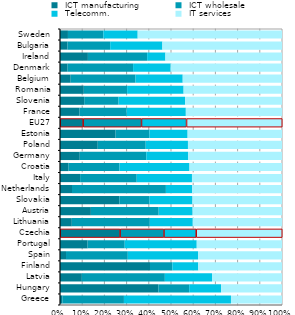
| Category |  ICT manufacturing |  ICT wholesale |  Telecomm. |  IT services |
|---|---|---|---|---|
| Greece | 0.011 | 0.277 | 0.482 | 0.23 |
| Hungary | 0.443 | 0.139 | 0.144 | 0.274 |
| Latvia | 0.098 | 0.374 | 0.213 | 0.315 |
| Finland | 0.405 | 0.101 | 0.117 | 0.377 |
| Spain | 0.027 | 0.278 | 0.316 | 0.378 |
| Portugal | 0.124 | 0.167 | 0.324 | 0.384 |
| Czechia | 0.27 | 0.198 | 0.145 | 0.387 |
| Lithuania | 0.053 | 0.351 | 0.194 | 0.402 |
| Austria | 0.139 | 0.305 | 0.153 | 0.403 |
| Slovakia | 0.267 | 0.136 | 0.193 | 0.403 |
| Netherlands | 0.054 | 0.423 | 0.118 | 0.405 |
| Italy | 0.091 | 0.255 | 0.249 | 0.406 |
| Croatia | 0.039 | 0.229 | 0.315 | 0.417 |
| Germany | 0.089 | 0.3 | 0.188 | 0.423 |
| Poland | 0.17 | 0.216 | 0.19 | 0.424 |
| Estonia | 0.25 | 0.152 | 0.172 | 0.425 |
| EU27 | 0.103 | 0.263 | 0.203 | 0.431 |
| France | 0.088 | 0.212 | 0.266 | 0.433 |
| Slovenia | 0.109 | 0.155 | 0.3 | 0.436 |
| Romania | 0.107 | 0.195 | 0.254 | 0.443 |
| Belgium | 0.048 | 0.292 | 0.213 | 0.447 |
| Denmark | 0.034 | 0.295 | 0.169 | 0.501 |
| Ireland | 0.126 | 0.267 | 0.082 | 0.525 |
| Bulgaria | 0.034 | 0.192 | 0.235 | 0.539 |
| Sweden | 0.036 | 0.16 | 0.155 | 0.65 |